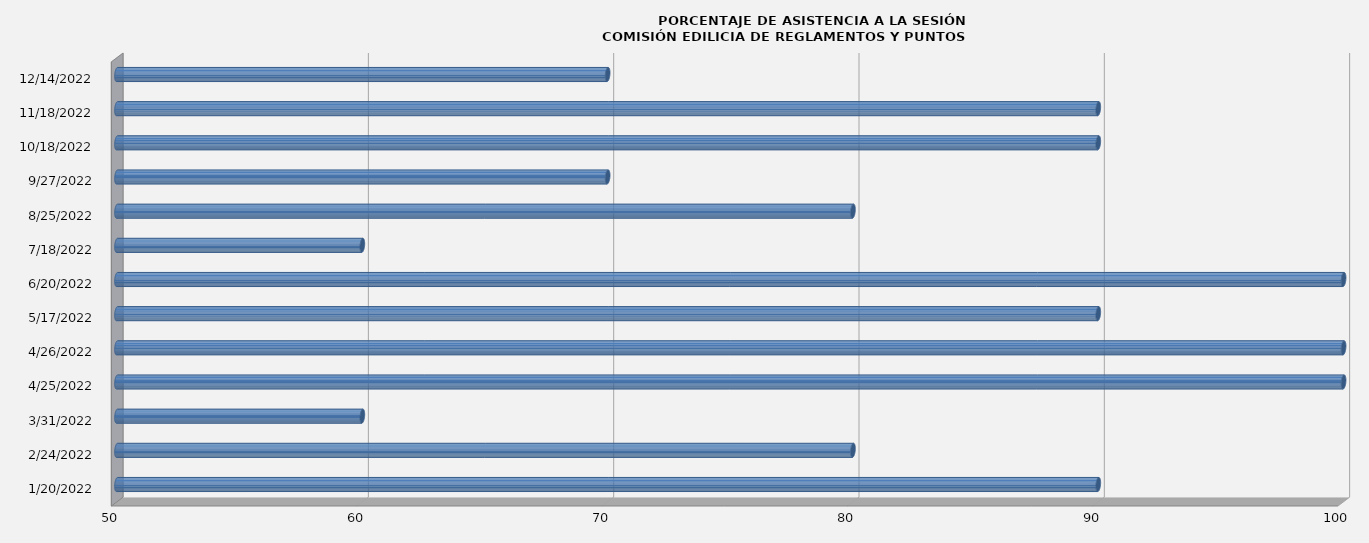
| Category | Series 0 |
|---|---|
| 1/20/22 | 90 |
| 2/24/22 | 80 |
| 3/31/22 | 60 |
| 4/25/22 | 100 |
| 4/26/22 | 100 |
| 5/17/22 | 90 |
| 6/20/22 | 100 |
| 7/18/22 | 60 |
| 8/25/22 | 80 |
| 9/27/22 | 70 |
| 10/18/22 | 90 |
| 11/18/22 | 90 |
| 12/14/22 | 70 |